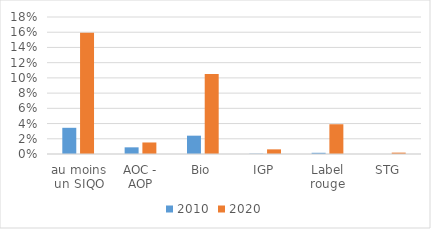
| Category | 2010 | 2020 |
|---|---|---|
| au moins un SIQO | 0.034 | 0.159 |
| AOC - AOP | 0.009 | 0.015 |
| Bio | 0.024 | 0.105 |
| IGP | 0 | 0.006 |
| Label rouge | 0.002 | 0.039 |
| STG | 0 | 0.002 |